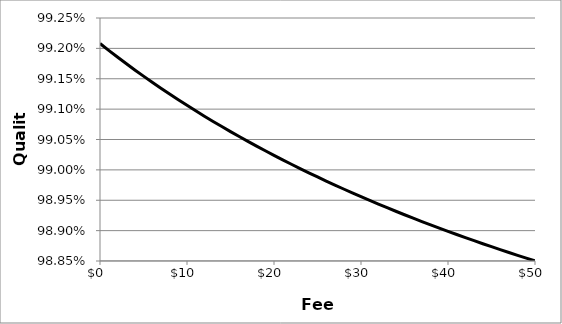
| Category | Quality |
|---|---|
| 0.0 | 0.992 |
| 1.0 | 0.992 |
| 2.0 | 0.992 |
| 3.0 | 0.992 |
| 4.0 | 0.992 |
| 5.0 | 0.992 |
| 6.0 | 0.991 |
| 7.0 | 0.991 |
| 8.0 | 0.991 |
| 9.0 | 0.991 |
| 10.0 | 0.991 |
| 11.0 | 0.991 |
| 12.0 | 0.991 |
| 13.0 | 0.991 |
| 14.0 | 0.991 |
| 15.0 | 0.991 |
| 16.0 | 0.991 |
| 17.0 | 0.99 |
| 18.0 | 0.99 |
| 19.0 | 0.99 |
| 20.0 | 0.99 |
| 21.0 | 0.99 |
| 22.0 | 0.99 |
| 23.0 | 0.99 |
| 24.0 | 0.99 |
| 25.0 | 0.99 |
| 26.0 | 0.99 |
| 27.0 | 0.99 |
| 28.0 | 0.99 |
| 29.0 | 0.99 |
| 30.0 | 0.99 |
| 31.0 | 0.989 |
| 32.0 | 0.989 |
| 33.0 | 0.989 |
| 34.0 | 0.989 |
| 35.0 | 0.989 |
| 36.0 | 0.989 |
| 37.0 | 0.989 |
| 38.0 | 0.989 |
| 39.0 | 0.989 |
| 40.0 | 0.989 |
| 41.0 | 0.989 |
| 42.0 | 0.989 |
| 43.0 | 0.989 |
| 44.0 | 0.989 |
| 45.0 | 0.989 |
| 46.0 | 0.989 |
| 47.0 | 0.989 |
| 48.0 | 0.989 |
| 49.0 | 0.989 |
| 50.0 | 0.988 |